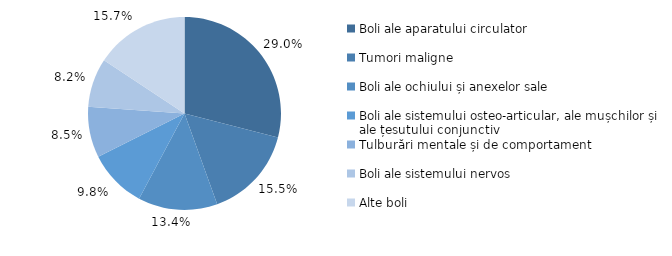
| Category | Series 0 |
|---|---|
| Boli ale aparatului circulator | 29 |
| Tumori maligne | 15.5 |
| Boli ale ochiului și anexelor sale | 13.3 |
| Boli ale sistemului osteo-articular, ale mușchilor și ale țesutului conjunctiv | 9.8 |
| Tulburări mentale și de comportament | 8.5 |
| Boli ale sistemului nervos | 8.2 |
| Alte boli | 15.7 |